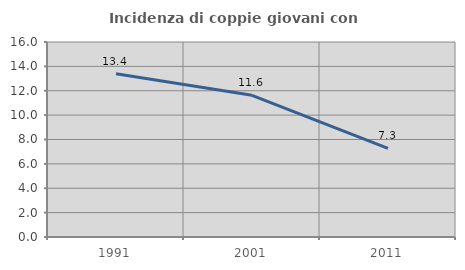
| Category | Incidenza di coppie giovani con figli |
|---|---|
| 1991.0 | 13.395 |
| 2001.0 | 11.628 |
| 2011.0 | 7.28 |